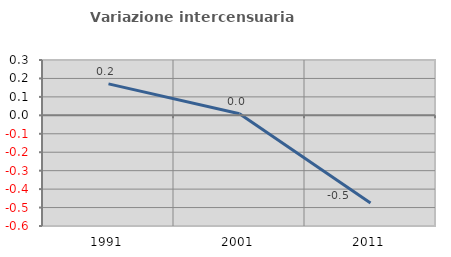
| Category | Variazione intercensuaria annua |
|---|---|
| 1991.0 | 0.171 |
| 2001.0 | 0.009 |
| 2011.0 | -0.475 |